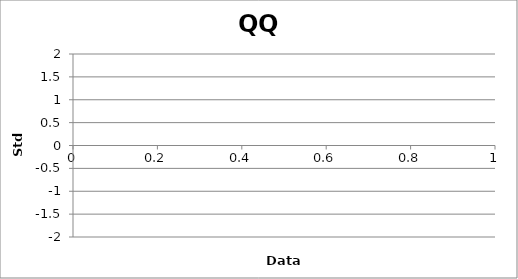
| Category | Series 0 |
|---|---|
| 0.0 | -1.534 |
| 0.0 | -0.887 |
| 0.0 | -0.489 |
| 0.0 | -0.157 |
| 0.0 | 0.157 |
| 0.0 | 0.489 |
| 0.0 | 0.887 |
| 0.0 | 1.534 |